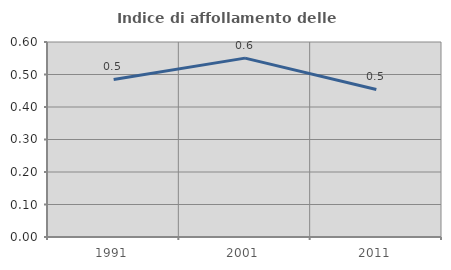
| Category | Indice di affollamento delle abitazioni  |
|---|---|
| 1991.0 | 0.485 |
| 2001.0 | 0.55 |
| 2011.0 | 0.454 |